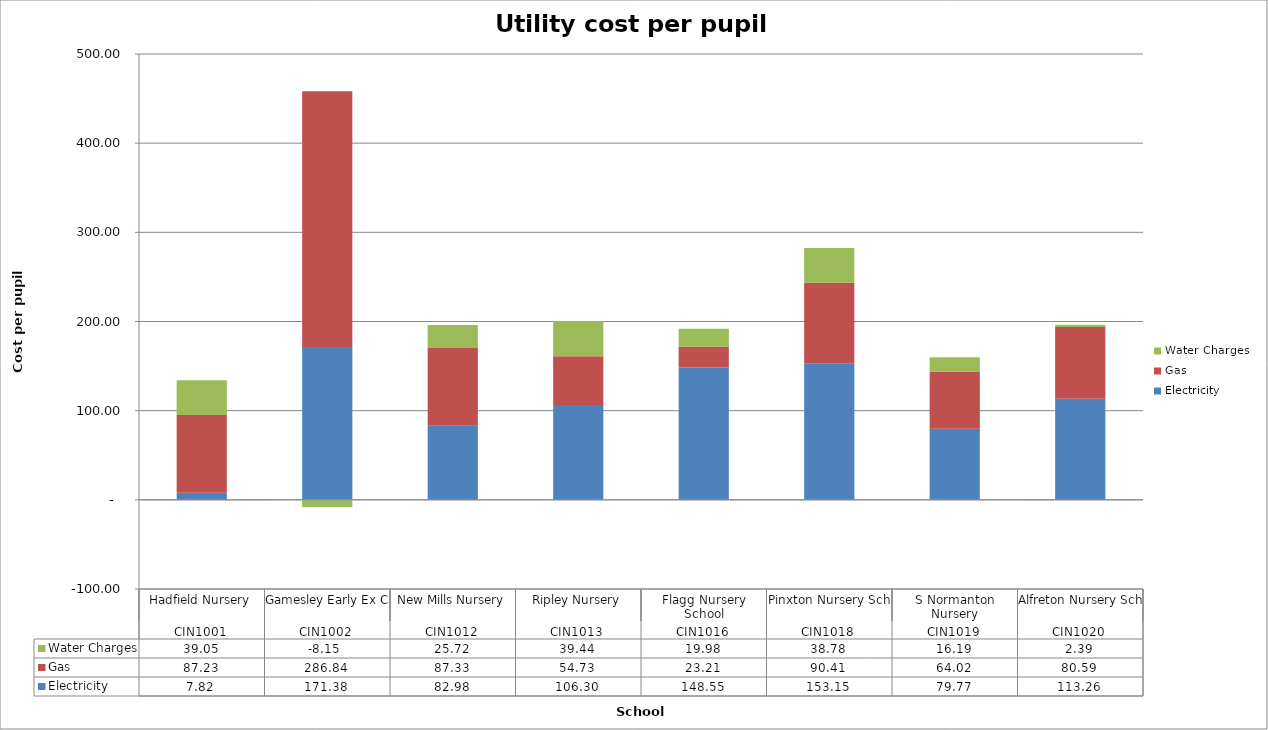
| Category | Electricity | Gas | Water Charges |
|---|---|---|---|
| 0 | 7.823 | 87.233 | 39.053 |
| 1 | 171.381 | 286.842 | -8.149 |
| 2 | 82.983 | 87.332 | 25.72 |
| 3 | 106.302 | 54.729 | 39.436 |
| 4 | 148.546 | 23.208 | 19.977 |
| 5 | 153.148 | 90.41 | 38.781 |
| 6 | 79.771 | 64.019 | 16.193 |
| 7 | 113.262 | 80.592 | 2.391 |